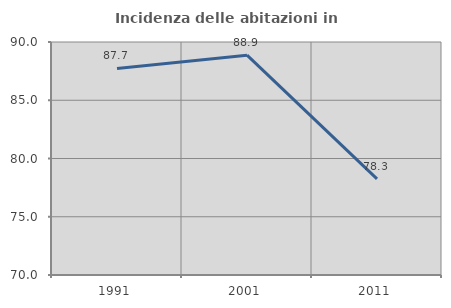
| Category | Incidenza delle abitazioni in proprietà  |
|---|---|
| 1991.0 | 87.731 |
| 2001.0 | 88.871 |
| 2011.0 | 78.257 |